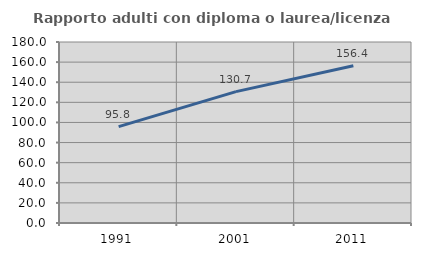
| Category | Rapporto adulti con diploma o laurea/licenza media  |
|---|---|
| 1991.0 | 95.833 |
| 2001.0 | 130.682 |
| 2011.0 | 156.426 |